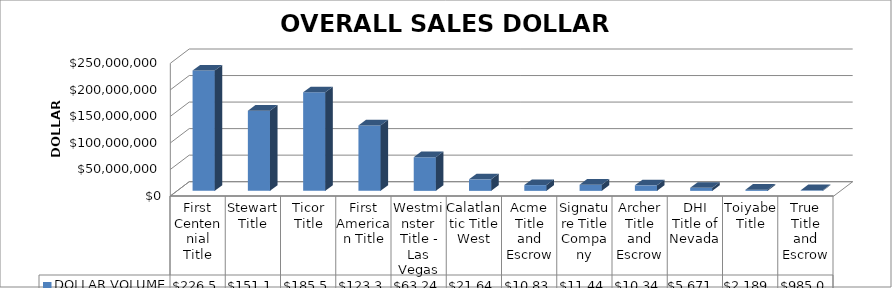
| Category | DOLLAR VOLUME |
|---|---|
| First Centennial Title | 226554478 |
| Stewart Title | 151155013 |
| Ticor Title | 185573627 |
| First American Title | 123336488.93 |
| Westminster Title - Las Vegas | 63241055 |
| Calatlantic Title West | 21648701 |
| Acme Title and Escrow | 10839000 |
| Signature Title Company | 11440612 |
| Archer Title and Escrow | 10346175 |
| DHI Title of Nevada | 5671525 |
| Toiyabe Title | 2189000 |
| True Title and Escrow | 985000 |